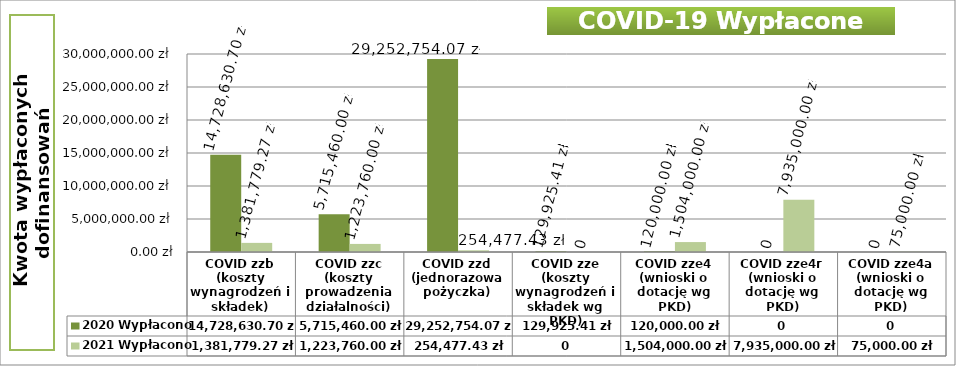
| Category | 2020 Wypłacono | 2021 Wypłacono |
|---|---|---|
| COVID zzb (koszty wynagrodzeń i składek) | 14728630.7 | 1381779.27 |
| COVID zzc (koszty prowadzenia działalności) | 5715460 | 1223760 |
| COVID zzd (jednorazowa pożyczka) | 29252754.07 | 254477.43 |
| COVID zze (koszty wynagrodzeń i składek wg PKD) | 129925.41 | 0 |
| COVID zze4 (wnioski o dotację wg PKD) | 120000 | 1504000 |
| COVID zze4r (wnioski o dotację wg PKD) | 0 | 7935000 |
| COVID zze4a (wnioski o dotację wg PKD) | 0 | 75000 |